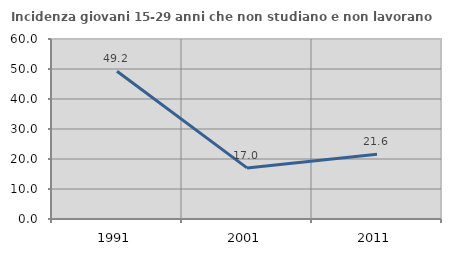
| Category | Incidenza giovani 15-29 anni che non studiano e non lavorano  |
|---|---|
| 1991.0 | 49.24 |
| 2001.0 | 17.034 |
| 2011.0 | 21.575 |